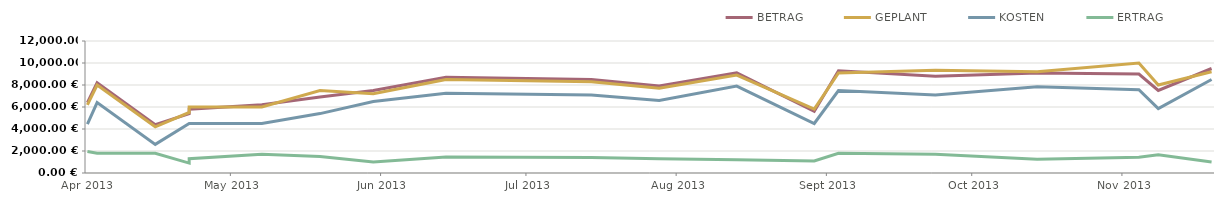
| Category | BETRAG | GEPLANT | KOSTEN | ERTRAG |
|---|---|---|---|---|
| 2013-04-23 | 6400 | 6200 | 4450 | 1950 |
| 2013-04-25 | 8200 | 8000 | 6400 | 1800 |
| 2013-05-07 | 4400 | 4200 | 2600 | 1800 |
| 2013-05-14 | 5400 | 5500 | 4500 | 900 |
| 2013-05-14 | 5800 | 6000 | 4500 | 1300 |
| 2013-05-29 | 6200 | 6000 | 4500 | 1700 |
| 2013-06-10 | 6900 | 7500 | 5400 | 1500 |
| 2013-06-21 | 7500 | 7200 | 6500 | 1000 |
| 2013-07-06 | 8700 | 8500 | 7250 | 1450 |
| 2013-08-05 | 8500 | 8300 | 7100 | 1400 |
| 2013-08-19 | 7900 | 7700 | 6600 | 1300 |
| 2013-09-04 | 9100 | 8900 | 7900 | 1200 |
| 2013-09-20 | 5600 | 5800 | 4500 | 1100 |
| 2013-09-25 | 9300 | 9100 | 7500 | 1800 |
| 2013-10-15 | 8800 | 9350 | 7100 | 1700 |
| 2013-11-05 | 9100 | 9200 | 7850 | 1250 |
| 2013-11-26 | 9000 | 10000 | 7575 | 1425 |
| 2013-11-30 | 7500 | 8000 | 5850 | 1650 |
| 2013-12-11 | 9500 | 9200 | 8500 | 1000 |